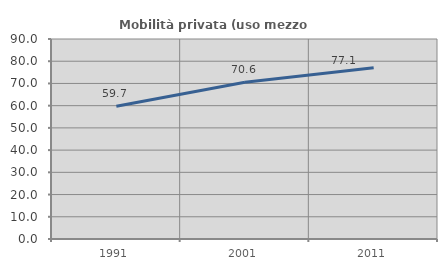
| Category | Mobilità privata (uso mezzo privato) |
|---|---|
| 1991.0 | 59.746 |
| 2001.0 | 70.561 |
| 2011.0 | 77.065 |